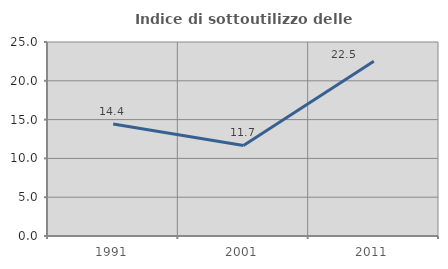
| Category | Indice di sottoutilizzo delle abitazioni  |
|---|---|
| 1991.0 | 14.439 |
| 2001.0 | 11.675 |
| 2011.0 | 22.523 |